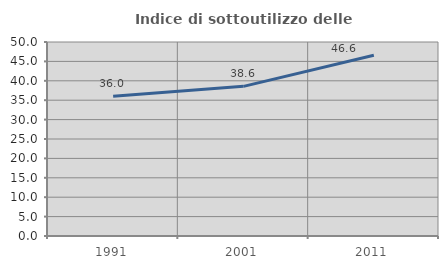
| Category | Indice di sottoutilizzo delle abitazioni  |
|---|---|
| 1991.0 | 36 |
| 2001.0 | 38.569 |
| 2011.0 | 46.602 |